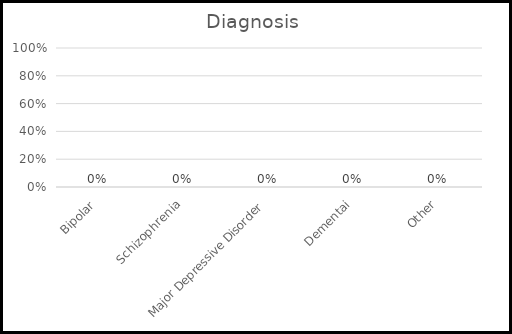
| Category | Diagnosis |
|---|---|
| Bipolar | 0 |
| Schizophrenia | 0 |
| Major Depressive Disorder | 0 |
| Dementai | 0 |
| Other | 0 |